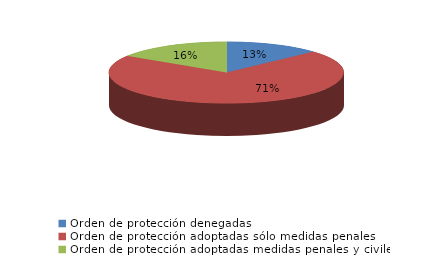
| Category | Series 0 |
|---|---|
| Orden de protección denegadas | 19 |
| Orden de protección adoptadas sólo medidas penales | 103 |
| Orden de protección adoptadas medidas penales y civiles | 23 |